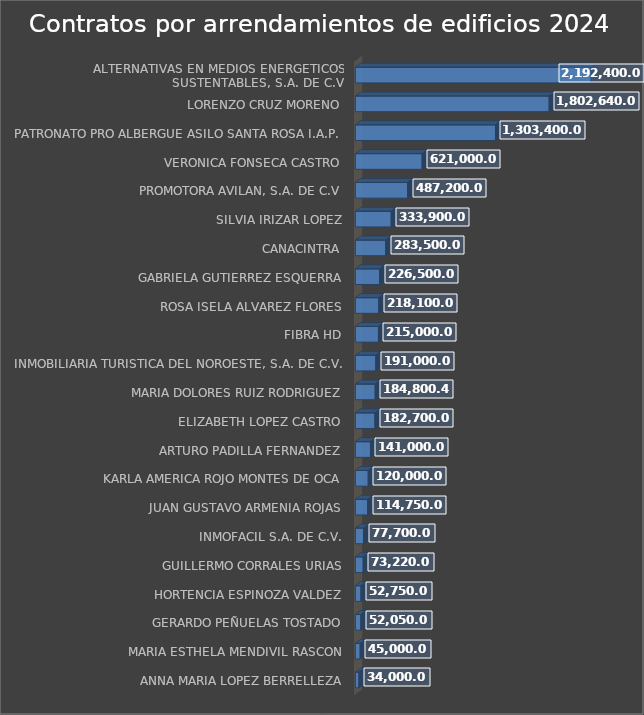
| Category | Total |
|---|---|
| ANNA MARIA LOPEZ BERRELLEZA | 34000 |
| MARIA ESTHELA MENDIVIL RASCON | 45000 |
| GERARDO PEÑUELAS TOSTADO | 52050 |
| HORTENCIA ESPINOZA VALDEZ | 52750 |
| GUILLERMO CORRALES URIAS | 73220 |
| INMOFACIL S.A. DE C.V. | 77700 |
| JUAN GUSTAVO ARMENIA ROJAS | 114750 |
| KARLA AMERICA ROJO MONTES DE OCA | 120000 |
| ARTURO PADILLA FERNANDEZ | 141000 |
| ELIZABETH LOPEZ CASTRO | 182700 |
| MARIA DOLORES RUIZ RODRIGUEZ | 184800.4 |
| INMOBILIARIA TURISTICA DEL NOROESTE, S.A. DE C.V. | 191000 |
| FIBRA HD | 215000 |
| ROSA ISELA ALVAREZ FLORES | 218100 |
| GABRIELA GUTIERREZ ESQUERRA | 226500 |
| CANACINTRA | 283500 |
| SILVIA IRIZAR LOPEZ | 333900 |
| PROMOTORA AVILAN, S.A. DE C.V | 487200 |
| VERONICA FONSECA CASTRO | 621000 |
| PATRONATO PRO ALBERGUE ASILO SANTA ROSA I.A.P. | 1303400 |
| LORENZO CRUZ MORENO | 1802640 |
| ALTERNATIVAS EN MEDIOS ENERGETICOS SUSTENTABLES, S.A. DE C.V. | 2192400 |